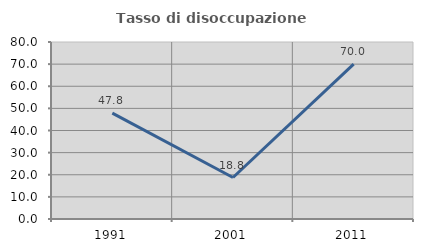
| Category | Tasso di disoccupazione giovanile  |
|---|---|
| 1991.0 | 47.826 |
| 2001.0 | 18.75 |
| 2011.0 | 70 |